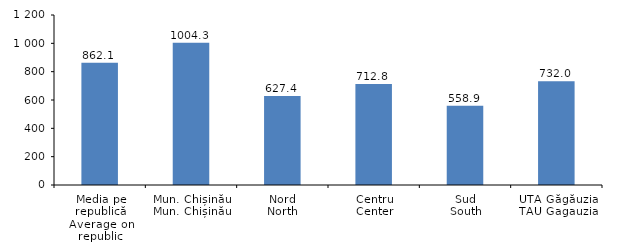
| Category | Series 0 |
|---|---|
| Media pe republică
Average on republic | 862.1 |
| Mun. Chișinău
Mun. Chișinău | 1004.3 |
| Nord
North | 627.4 |
| Centru
Center | 712.8 |
| Sud
South | 558.9 |
| UTA Găgăuzia
TAU Gagauzia | 732 |